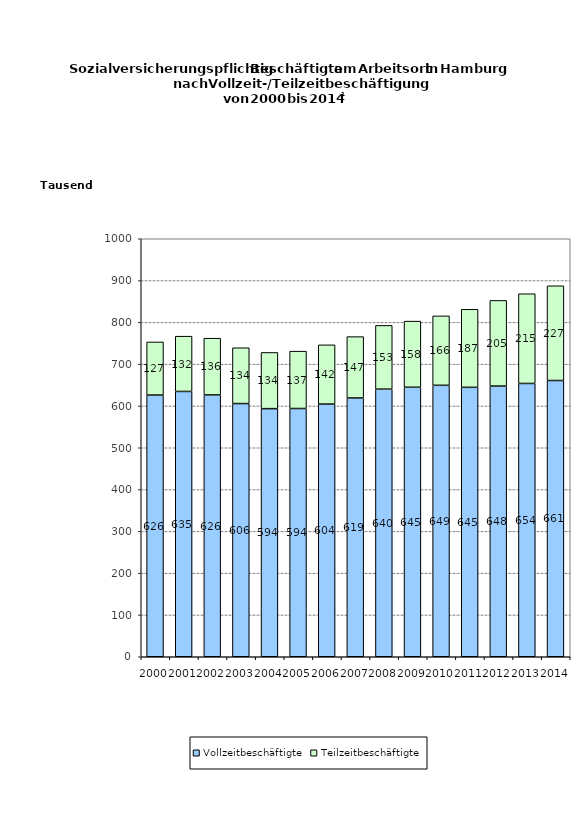
| Category | Vollzeitbeschäftigte | Teilzeitbeschäftigte |
|---|---|---|
| 2000.0 | 626047 | 127091 |
| 2001.0 | 634688 | 132231 |
| 2002.0 | 626402 | 135678 |
| 2003.0 | 605715 | 133522 |
| 2004.0 | 593547 | 134454 |
| 2005.0 | 593868 | 137253 |
| 2006.0 | 604458 | 141740 |
| 2007.0 | 619086 | 146785 |
| 2008.0 | 640202 | 152519 |
| 2009.0 | 644703 | 158253 |
| 2010.0 | 649378 | 166112 |
| 2011.0 | 644546 | 186707 |
| 2012.0 | 647561 | 204920 |
| 2013.0 | 653802 | 214677 |
| 2014.0 | 660874 | 226624 |